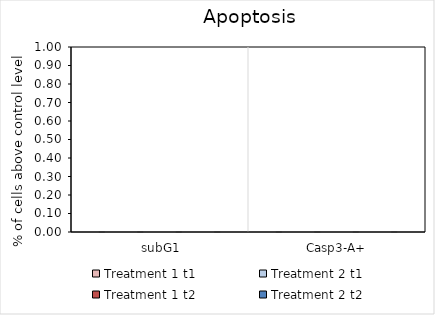
| Category | Treatment 1 | Treatment 2 |
|---|---|---|
|  subG1 | 0 | 0 |
|  Casp3-A+ | 0 | 0 |